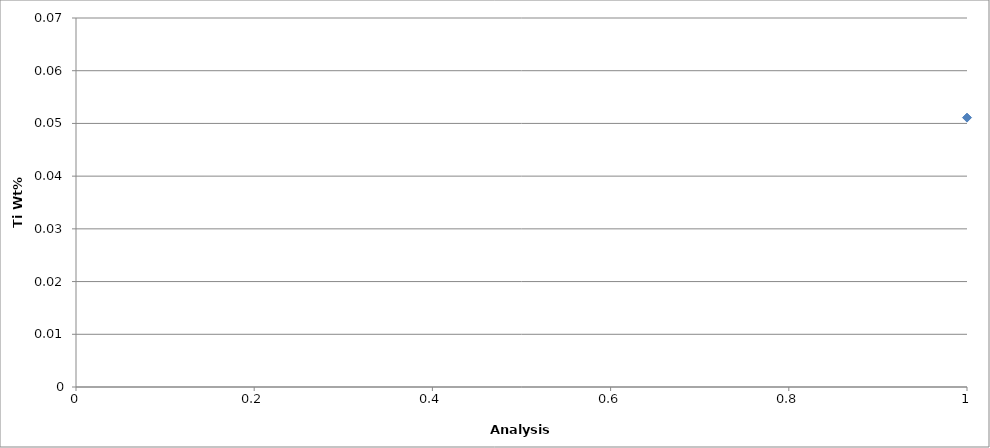
| Category | Series 0 |
|---|---|
| 0 | 0.051 |
| 1 | 0.032 |
| 2 | 0.047 |
| 3 | 0.048 |
| 4 | 0.047 |
| 5 | 0.043 |
| 6 | 0.042 |
| 7 | 0.047 |
| 8 | 0.047 |
| 9 | 0.036 |
| 10 | 0.047 |
| 11 | 0.05 |
| 12 | 0.05 |
| 13 | 0.042 |
| 14 | 0.048 |
| 15 | 0.051 |
| 16 | 0.047 |
| 17 | 0.066 |
| 18 | 0.056 |
| 19 | 0.052 |
| 20 | 0.048 |
| 21 | 0.062 |
| 22 | 0.044 |
| 23 | 0.047 |
| 24 | 0.046 |
| 25 | 0.048 |
| 26 | 0.041 |
| 27 | 0.048 |
| 28 | 0.047 |
| 29 | 0.047 |
| 30 | 0.054 |
| 31 | 0.048 |
| 32 | 0.046 |
| 33 | 0.047 |
| 34 | 0.044 |
| 35 | 0.046 |
| 36 | 0.04 |
| 37 | 0.054 |
| 38 | 0.046 |
| 39 | 0.048 |
| 40 | 0.048 |
| 41 | 0.046 |
| 42 | 0.046 |
| 43 | 0.04 |
| 44 | 0.044 |
| 45 | 0.046 |
| 46 | 0.047 |
| 47 | 0.046 |
| 48 | 0.049 |
| 49 | 0.049 |
| 50 | 0.05 |
| 51 | 0.045 |
| 52 | 0.047 |
| 53 | 0.047 |
| 54 | 0.047 |
| 55 | 0.046 |
| 56 | 0.047 |
| 57 | 0.048 |
| 58 | 0.046 |
| 59 | 0.049 |
| 60 | 0.057 |
| 61 | 0.046 |
| 62 | 0.047 |
| 63 | 0.043 |
| 64 | 0.043 |
| 65 | 0.046 |
| 66 | 0.046 |
| 67 | 0.046 |
| 68 | 0.046 |
| 69 | 0.05 |
| 70 | 0.046 |
| 71 | 0.046 |
| 72 | 0.048 |
| 73 | 0.041 |
| 74 | 0.048 |
| 75 | 0.046 |
| 76 | 0.048 |
| 77 | 0.048 |
| 78 | 0.042 |
| 79 | 0.046 |